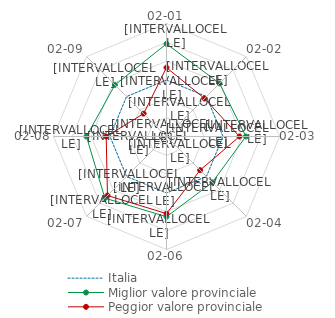
| Category | Italia | Miglior valore provinciale | Peggior valore provinciale |
|---|---|---|---|
| 02-01 | 0 | 1.92 | 0.659 |
| 02-02 | 0 | 0.987 | -0.146 |
| 02-03 | 0 | 1.213 | 0.876 |
| 02-04 | 0 | 0.442 | -0.475 |
| 02-06 | 0 | 1.26 | 1.094 |
| 02-07 | 0 | 1.628 | 1.432 |
| 02-08 | 0 | 1.251 | 0.202 |
| 02-09 | 0 | 0.875 | -1.284 |